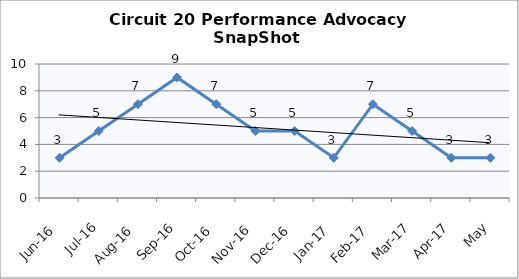
| Category | Circuit 20 |
|---|---|
| Jun-16 | 3 |
| Jul-16 | 5 |
| Aug-16 | 7 |
| Sep-16 | 9 |
| Oct-16 | 7 |
| Nov-16 | 5 |
| Dec-16 | 5 |
| Jan-17 | 3 |
| Feb-17 | 7 |
| Mar-17 | 5 |
| Apr-17 | 3 |
| May | 3 |